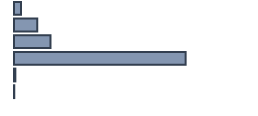
| Category | Percentatge |
|---|---|
| 0 | 2.928 |
| 1 | 9.685 |
| 2 | 15.203 |
| 3 | 71.509 |
| 4 | 0.563 |
| 5 | 0.113 |